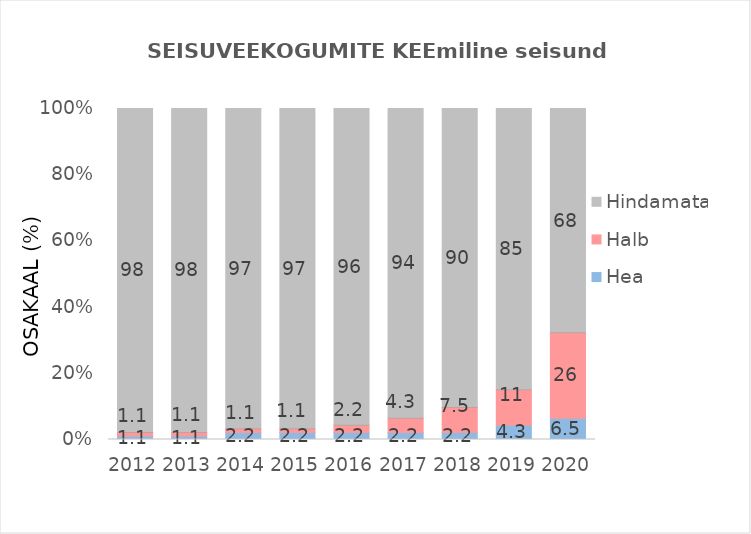
| Category | Hea  | Halb | Hindamata |
|---|---|---|---|
| 2012.0 | 1.075 | 1.075 | 97.849 |
| 2013.0 | 1.075 | 1.075 | 97.849 |
| 2014.0 | 2.151 | 1.075 | 96.774 |
| 2015.0 | 2.151 | 1.075 | 96.774 |
| 2016.0 | 2.151 | 2.151 | 95.699 |
| 2017.0 | 2.151 | 4.301 | 93.548 |
| 2018.0 | 2.151 | 7.527 | 90.323 |
| 2019.0 | 4.301 | 10.753 | 84.946 |
| 2020.0 | 6.452 | 25.806 | 67.742 |